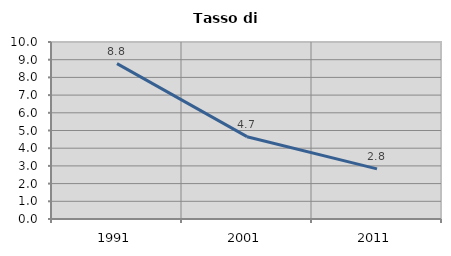
| Category | Tasso di disoccupazione   |
|---|---|
| 1991.0 | 8.78 |
| 2001.0 | 4.651 |
| 2011.0 | 2.83 |